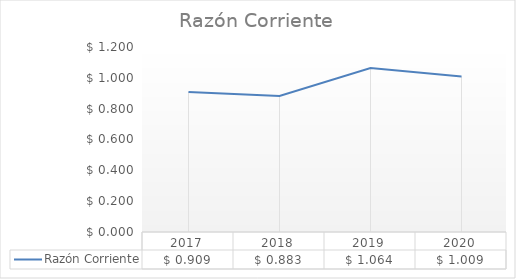
| Category | Razón Corriente |
|---|---|
| 2017.0 | 0.909 |
| 2018.0 | 0.883 |
| 2019.0 | 1.064 |
| 2020.0 | 1.009 |